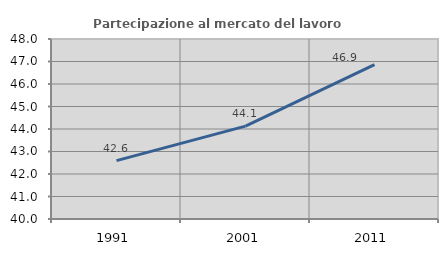
| Category | Partecipazione al mercato del lavoro  femminile |
|---|---|
| 1991.0 | 42.594 |
| 2001.0 | 44.128 |
| 2011.0 | 46.86 |